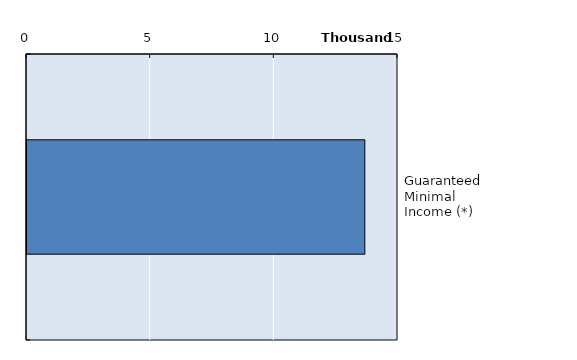
| Category | Series 0 |
|---|---|
| Guaranteed Minimal Income (*) | 13659 |